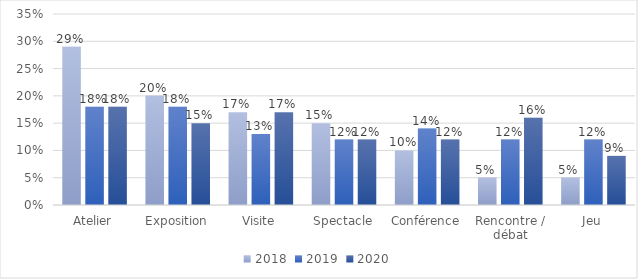
| Category | 2018 | 2019 | 2020 |
|---|---|---|---|
| Atelier | 0.29 | 0.18 | 0.18 |
| Exposition | 0.2 | 0.18 | 0.15 |
| Visite | 0.17 | 0.13 | 0.17 |
| Spectacle | 0.15 | 0.12 | 0.12 |
| Conférence | 0.1 | 0.14 | 0.12 |
| Rencontre / débat | 0.05 | 0.12 | 0.16 |
| Jeu | 0.05 | 0.12 | 0.09 |